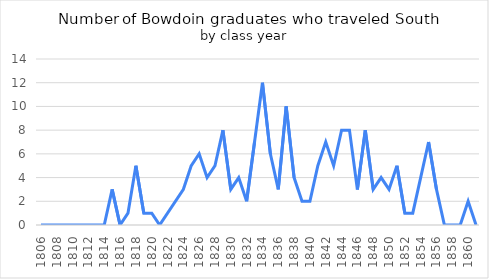
| Category | Series 0 |
|---|---|
| 1806.0 | 0 |
| 1807.0 | 0 |
| 1808.0 | 0 |
| 1809.0 | 0 |
| 1810.0 | 0 |
| 1811.0 | 0 |
| 1812.0 | 0 |
| 1813.0 | 0 |
| 1814.0 | 0 |
| 1815.0 | 3 |
| 1816.0 | 0 |
| 1817.0 | 1 |
| 1818.0 | 5 |
| 1819.0 | 1 |
| 1820.0 | 1 |
| 1821.0 | 0 |
| 1822.0 | 1 |
| 1823.0 | 2 |
| 1824.0 | 3 |
| 1825.0 | 5 |
| 1826.0 | 6 |
| 1827.0 | 4 |
| 1828.0 | 5 |
| 1829.0 | 8 |
| 1830.0 | 3 |
| 1831.0 | 4 |
| 1832.0 | 2 |
| 1833.0 | 7 |
| 1834.0 | 12 |
| 1835.0 | 6 |
| 1836.0 | 3 |
| 1837.0 | 10 |
| 1838.0 | 4 |
| 1839.0 | 2 |
| 1840.0 | 2 |
| 1841.0 | 5 |
| 1842.0 | 7 |
| 1843.0 | 5 |
| 1844.0 | 8 |
| 1845.0 | 8 |
| 1846.0 | 3 |
| 1847.0 | 8 |
| 1848.0 | 3 |
| 1849.0 | 4 |
| 1850.0 | 3 |
| 1851.0 | 5 |
| 1852.0 | 1 |
| 1853.0 | 1 |
| 1854.0 | 4 |
| 1855.0 | 7 |
| 1856.0 | 3 |
| 1857.0 | 0 |
| 1858.0 | 0 |
| 1859.0 | 0 |
| 1860.0 | 2 |
| 1861.0 | 0 |